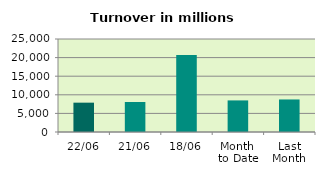
| Category | Series 0 |
|---|---|
| 22/06 | 7886.403 |
| 21/06 | 8068.925 |
| 18/06 | 20679.518 |
| Month 
to Date | 8492.276 |
| Last
Month | 8745.898 |